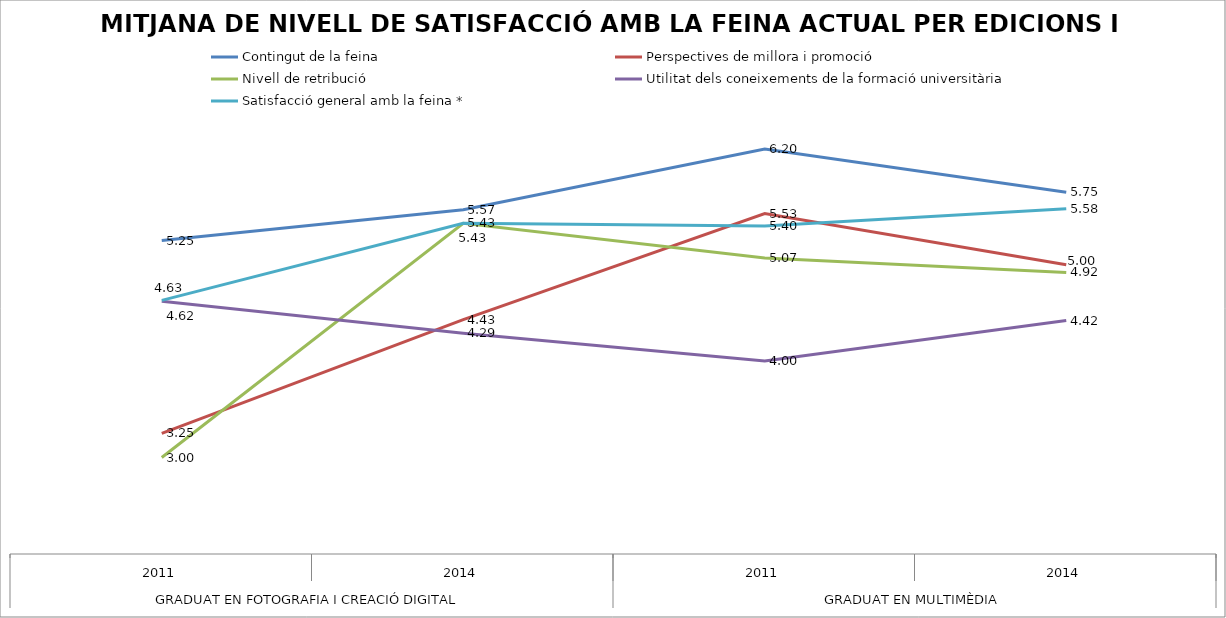
| Category | Contingut de la feina | Perspectives de millora i promoció | Nivell de retribució | Utilitat dels coneixements de la formació universitària | Satisfacció general amb la feina * |
|---|---|---|---|---|---|
| 0 | 5.25 | 3.25 | 3 | 4.62 | 4.63 |
| 1 | 5.57 | 4.43 | 5.43 | 4.29 | 5.43 |
| 2 | 6.2 | 5.53 | 5.07 | 4 | 5.4 |
| 3 | 5.75 | 5 | 4.92 | 4.42 | 5.58 |